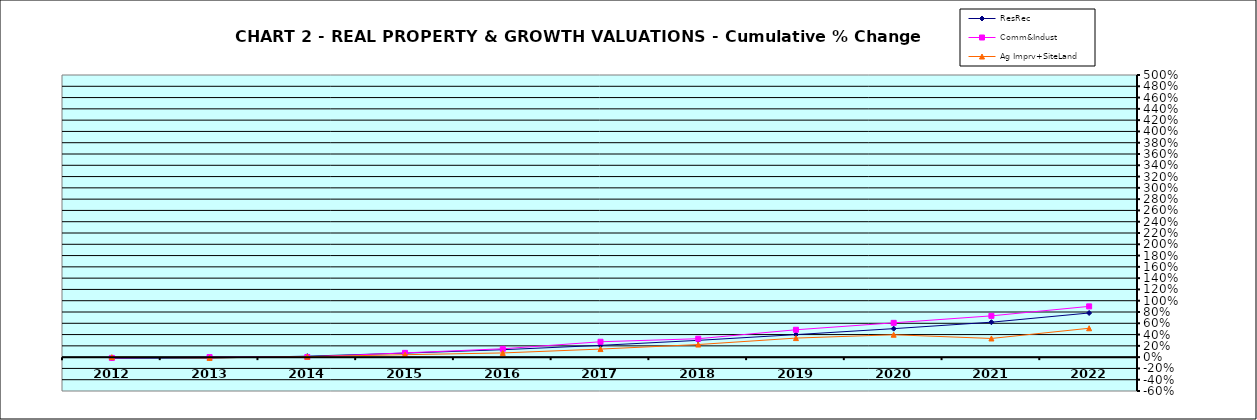
| Category | ResRec | Comm&Indust | Ag Imprv+SiteLand |
|---|---|---|---|
| 2012.0 | -0.019 | -0.014 | 0 |
| 2013.0 | -0.016 | 0.001 | -0.014 |
| 2014.0 | 0.017 | 0.003 | 0.009 |
| 2015.0 | 0.071 | 0.076 | 0.043 |
| 2016.0 | 0.132 | 0.148 | 0.075 |
| 2017.0 | 0.209 | 0.273 | 0.143 |
| 2018.0 | 0.298 | 0.326 | 0.223 |
| 2019.0 | 0.399 | 0.485 | 0.338 |
| 2020.0 | 0.505 | 0.608 | 0.397 |
| 2021.0 | 0.619 | 0.732 | 0.331 |
| 2022.0 | 0.782 | 0.9 | 0.512 |